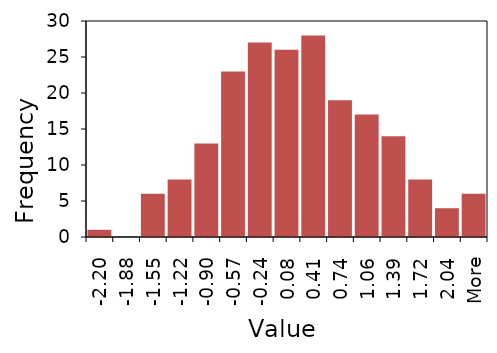
| Category | Series 1 |
|---|---|
| -2.20 | 1 |
| -1.88 | 0 |
| -1.55 | 6 |
| -1.22 | 8 |
| -0.90 | 13 |
| -0.57 | 23 |
| -0.24 | 27 |
| 0.08 | 26 |
| 0.41 | 28 |
| 0.74 | 19 |
| 1.06 | 17 |
| 1.39 | 14 |
| 1.72 | 8 |
| 2.04 | 4 |
| More | 6 |